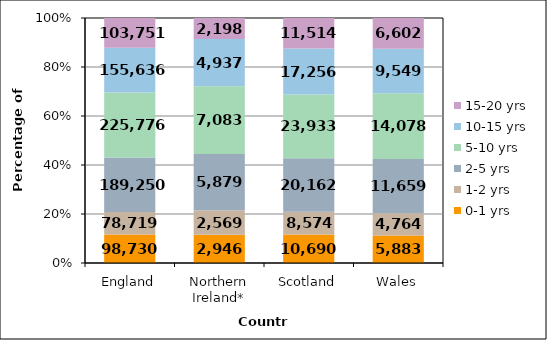
| Category | 0-1 yrs | 1-2 yrs | 2-5 yrs | 5-10 yrs | 10-15 yrs | 15-20 yrs |
|---|---|---|---|---|---|---|
| England | 98730 | 78719 | 189250 | 225776 | 155636 | 103751 |
| Northern Ireland* | 2946 | 2569 | 5879 | 7083 | 4937 | 2198 |
| Scotland | 10690 | 8574 | 20162 | 23933 | 17256 | 11514 |
| Wales | 5883 | 4764 | 11659 | 14078 | 9549 | 6602 |